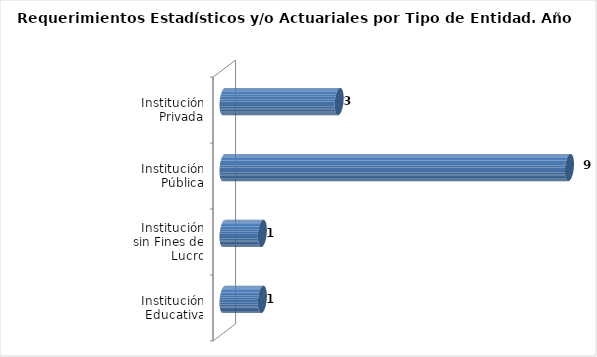
| Category | Total |
|---|---|
| Institución Educativa | 1 |
| Institución sin Fines de Lucro | 1 |
| Institución Pública | 9 |
| Institución Privada | 3 |